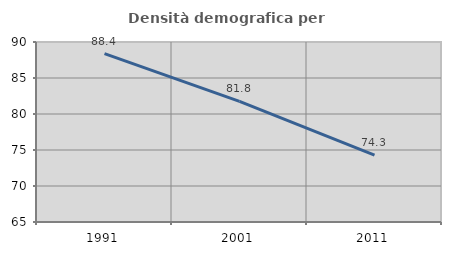
| Category | Densità demografica |
|---|---|
| 1991.0 | 88.376 |
| 2001.0 | 81.754 |
| 2011.0 | 74.28 |